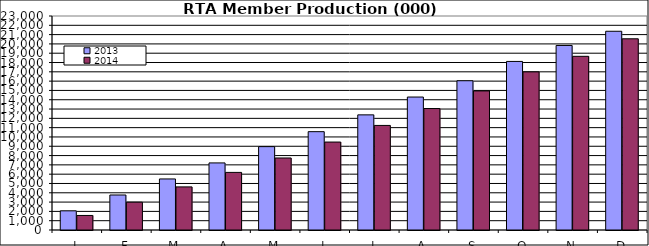
| Category | 2013 | 2014 |
|---|---|---|
| J | 2061.224 | 1562.786 |
| F | 3762.689 | 2990.831 |
| M | 5487.558 | 4632.581 |
| A | 7209.726 | 6190.113 |
| M | 8960.48 | 7741.465 |
| J | 10569.596 | 9452.54 |
| J | 12374.58 | 11238.529 |
| A | 14290.345 | 13054.044 |
| S | 16043.737 | 14946.178 |
| O | 18116.607 | 16994.763 |
| N | 19833.91 | 18666.086 |
| D | 21359.765 | 20549.894 |